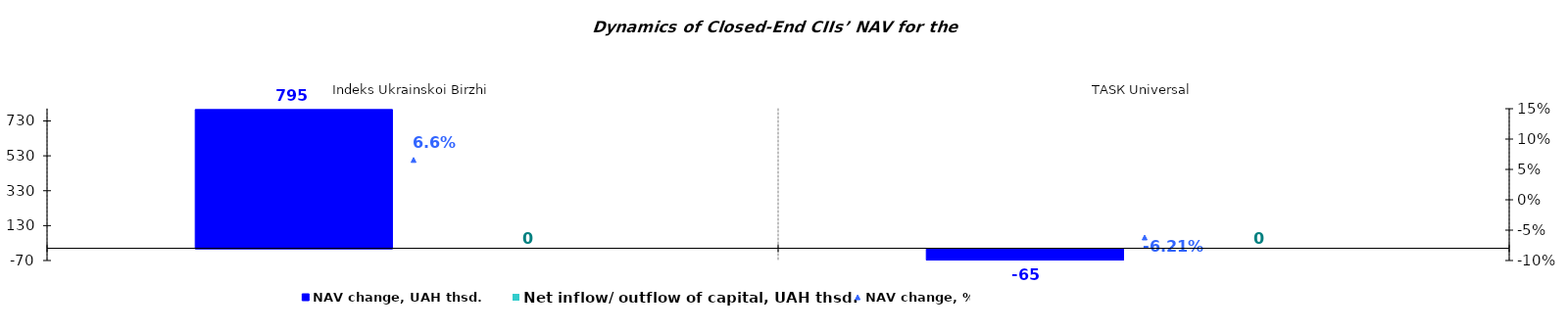
| Category | NAV change, UAH thsd. | Net inflow/ outflow of capital, UAH thsd. |
|---|---|---|
| Іndeks Ukrainskoi Birzhi | 795.261 | 0 |
| ТАSК Universal | -64.514 | 0 |